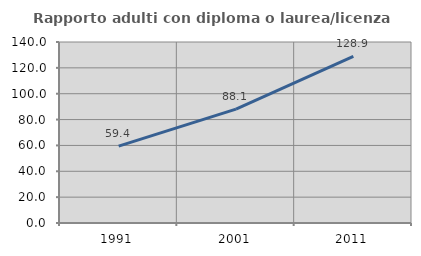
| Category | Rapporto adulti con diploma o laurea/licenza media  |
|---|---|
| 1991.0 | 59.439 |
| 2001.0 | 88.067 |
| 2011.0 | 128.871 |